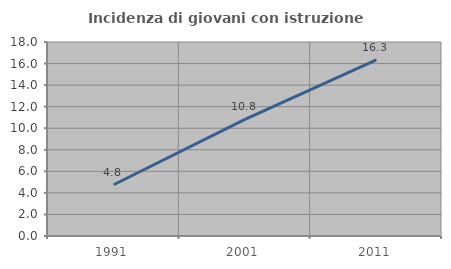
| Category | Incidenza di giovani con istruzione universitaria |
|---|---|
| 1991.0 | 4.752 |
| 2001.0 | 10.822 |
| 2011.0 | 16.343 |